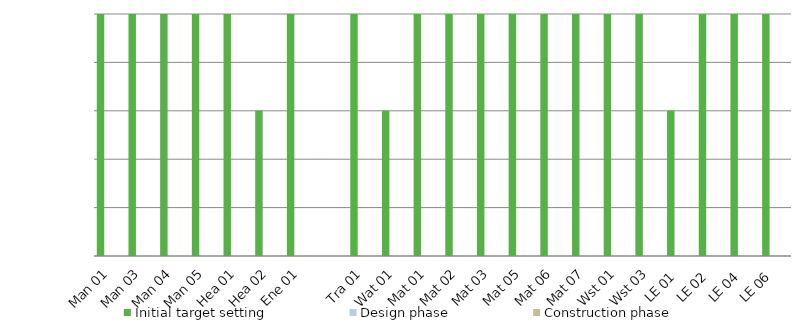
| Category | Initial target setting | Design phase | Construction phase |
|---|---|---|---|
| Man 01 | 5 | 0 | 0 |
| Man 03 | 5 | 0 | 0 |
| Man 04 | 5 | 0 | 0 |
| Man 05 | 5 | 0 | 0 |
| Hea 01 | 5 | 0 | 0 |
| Hea 02 | 3 | 0 | 0 |
| Ene 01 | 5 | 0 | 0 |
|  | 0 | 0 | 0 |
| Tra 01 | 5 | 0 | 0 |
| Wat 01 | 3 | 0 | 0 |
| Mat 01 | 5 | 0 | 0 |
| Mat 02 | 5 | 0 | 0 |
| Mat 03 | 5 | 0 | 0 |
| Mat 05 | 5 | 0 | 0 |
| Mat 06 | 5 | 0 | 0 |
| Mat 07 | 5 | 0 | 0 |
| Wst 01 | 5 | 0 | 0 |
| Wst 03 | 5 | 0 | 0 |
| LE 01 | 3 | 0 | 0 |
| LE 02 | 5 | 0 | 0 |
| LE 04 | 5 | 0 | 0 |
| LE 06 | 5 | 0 | 0 |